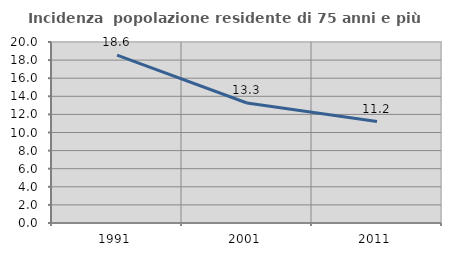
| Category | Incidenza  popolazione residente di 75 anni e più |
|---|---|
| 1991.0 | 18.551 |
| 2001.0 | 13.261 |
| 2011.0 | 11.207 |